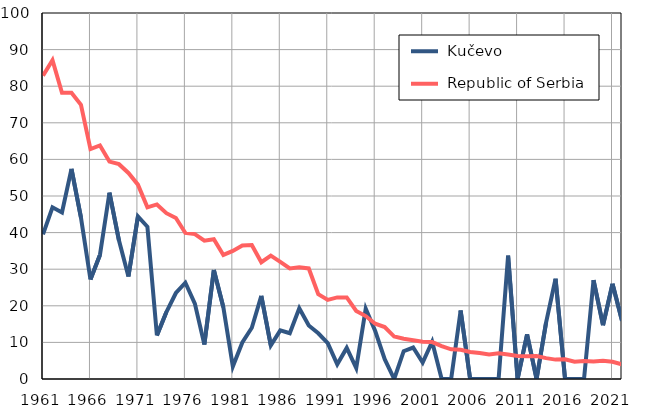
| Category |  Kučevo |  Republic of Serbia |
|---|---|---|
| 1961.0 | 39.5 | 82.9 |
| 1962.0 | 46.9 | 87.1 |
| 1963.0 | 45.5 | 78.2 |
| 1964.0 | 57.4 | 78.2 |
| 1965.0 | 44.1 | 74.9 |
| 1966.0 | 27.2 | 62.8 |
| 1967.0 | 33.9 | 63.8 |
| 1968.0 | 50.9 | 59.4 |
| 1969.0 | 37.9 | 58.7 |
| 1970.0 | 28 | 56.3 |
| 1971.0 | 44.4 | 53.1 |
| 1972.0 | 41.6 | 46.9 |
| 1973.0 | 11.9 | 47.7 |
| 1974.0 | 18.3 | 45.3 |
| 1975.0 | 23.5 | 44 |
| 1976.0 | 26.3 | 39.9 |
| 1977.0 | 20.6 | 39.6 |
| 1978.0 | 9.4 | 37.8 |
| 1979.0 | 29.8 | 38.2 |
| 1980.0 | 19.6 | 33.9 |
| 1981.0 | 3.4 | 35 |
| 1982.0 | 10 | 36.5 |
| 1983.0 | 14 | 36.6 |
| 1984.0 | 22.7 | 31.9 |
| 1985.0 | 9.2 | 33.7 |
| 1986.0 | 13.3 | 32 |
| 1987.0 | 12.5 | 30.2 |
| 1988.0 | 19.3 | 30.5 |
| 1989.0 | 14.6 | 30.2 |
| 1990.0 | 12.5 | 23.2 |
| 1991.0 | 9.8 | 21.6 |
| 1992.0 | 4 | 22.3 |
| 1993.0 | 8.5 | 22.3 |
| 1994.0 | 3 | 18.6 |
| 1995.0 | 19.2 | 17.2 |
| 1996.0 | 13.1 | 15.1 |
| 1997.0 | 5.4 | 14.2 |
| 1998.0 | 0 | 11.6 |
| 1999.0 | 7.6 | 11 |
| 2000.0 | 8.6 | 10.6 |
| 2001.0 | 4.5 | 10.2 |
| 2002.0 | 10.2 | 10.1 |
| 2003.0 | 0 | 9 |
| 2004.0 | 0 | 8.1 |
| 2005.0 | 18.7 | 8 |
| 2006.0 | 0 | 7.4 |
| 2007.0 | 0 | 7.1 |
| 2008.0 | 0 | 6.7 |
| 2009.0 | 0 | 7 |
| 2010.0 | 33.7 | 6.7 |
| 2011.0 | 0 | 6.3 |
| 2012.0 | 12.2 | 6.2 |
| 2013.0 | 0 | 6.3 |
| 2014.0 | 15.4 | 5.7 |
| 2015.0 | 27.4 | 5.3 |
| 2016.0 | 0 | 5.4 |
| 2017.0 | 0 | 4.7 |
| 2018.0 | 0 | 4.9 |
| 2019.0 | 27 | 4.8 |
| 2020.0 | 14.7 | 5 |
| 2021.0 | 26 | 4.7 |
| 2022.0 | 15.9 | 4 |